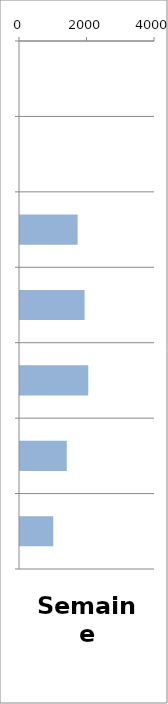
| Category | VL |
|---|---|
| 0 | 0 |
| 1 | 0 |
| 2 | 1709 |
| 3 | 1914 |
| 4 | 2022 |
| 5 | 1386 |
| 6 | 985 |